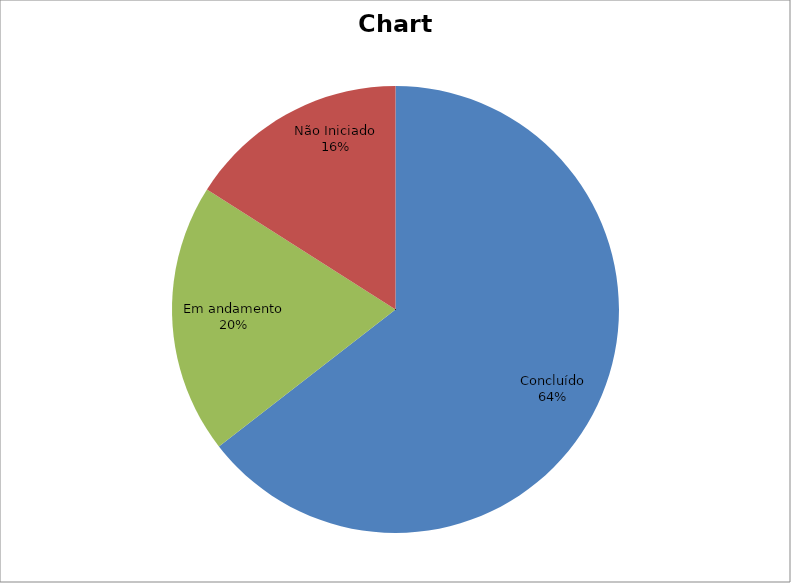
| Category | Series 0 |
|---|---|
| Concluído | 0.645 |
| Em andamento | 0.195 |
| Não Iniciado | 0.16 |